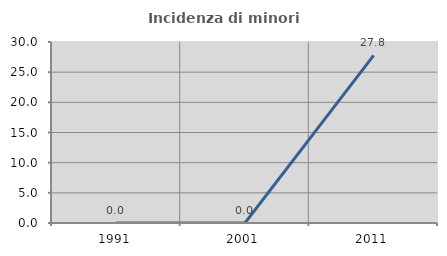
| Category | Incidenza di minori stranieri |
|---|---|
| 1991.0 | 0 |
| 2001.0 | 0 |
| 2011.0 | 27.778 |